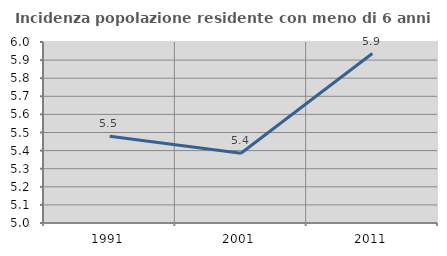
| Category | Incidenza popolazione residente con meno di 6 anni |
|---|---|
| 1991.0 | 5.479 |
| 2001.0 | 5.385 |
| 2011.0 | 5.936 |